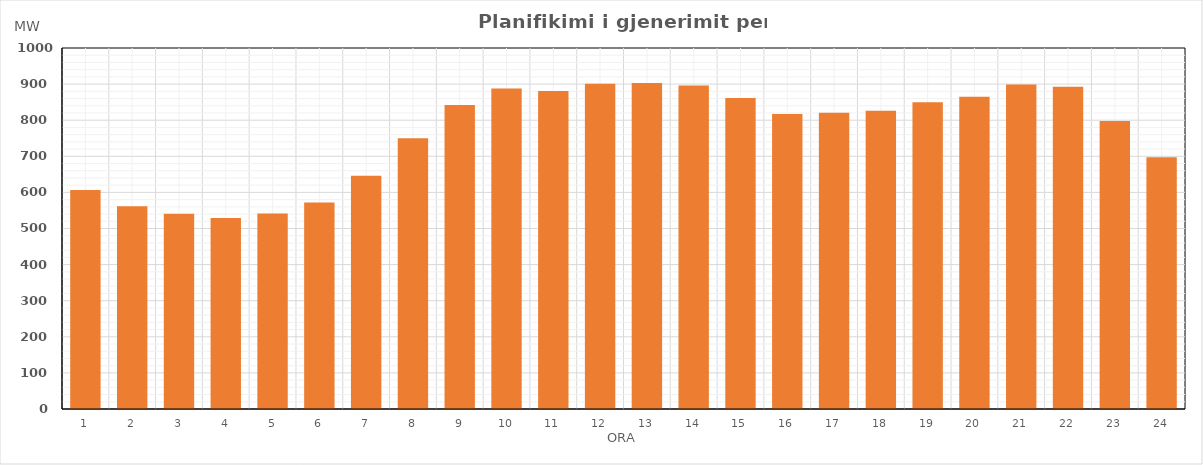
| Category | Max (MW) |
|---|---|
| 0 | 606.779 |
| 1 | 561.591 |
| 2 | 540.716 |
| 3 | 529.028 |
| 4 | 541.212 |
| 5 | 571.898 |
| 6 | 646.463 |
| 7 | 750.014 |
| 8 | 842.112 |
| 9 | 887.643 |
| 10 | 880.619 |
| 11 | 901.197 |
| 12 | 903.264 |
| 13 | 895.915 |
| 14 | 861.552 |
| 15 | 817.081 |
| 16 | 820.35 |
| 17 | 825.895 |
| 18 | 849.963 |
| 19 | 865.027 |
| 20 | 898.918 |
| 21 | 892.473 |
| 22 | 797.677 |
| 23 | 697.027 |